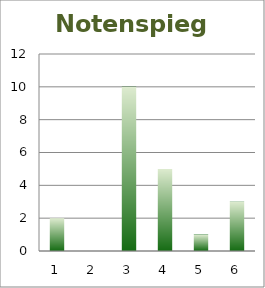
| Category | Series 0 |
|---|---|
| 0 | 2 |
| 1 | 0 |
| 2 | 10 |
| 3 | 5 |
| 4 | 1 |
| 5 | 3 |